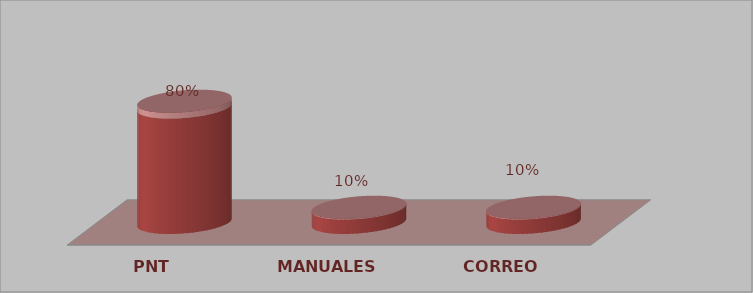
| Category | Series 0 | Series 1 |
|---|---|---|
| PNT | 16 | 0.8 |
| MANUALES | 2 | 0.1 |
| CORREO | 2 | 0.1 |